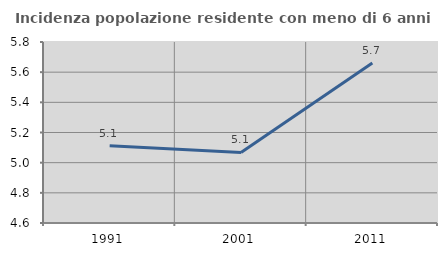
| Category | Incidenza popolazione residente con meno di 6 anni |
|---|---|
| 1991.0 | 5.112 |
| 2001.0 | 5.068 |
| 2011.0 | 5.66 |